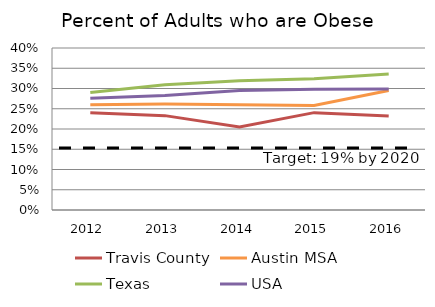
| Category | Travis County | Austin MSA | Texas | USA |
|---|---|---|---|---|
| 2012.0 | 0.24 | 0.26 | 0.29 | 0.276 |
| 2013.0 | 0.233 | 0.262 | 0.309 | 0.283 |
| 2014.0 | 0.205 | 0.26 | 0.319 | 0.295 |
| 2015.0 | 0.24 | 0.258 | 0.324 | 0.298 |
| 2016.0 | 0.232 | 0.295 | 0.336 | 0.299 |